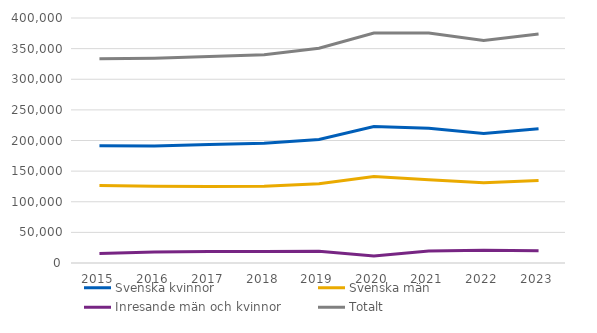
| Category | Svenska kvinnor | Svenska män | Inresande män och kvinnor | Totalt |
|---|---|---|---|---|
| 2015.0 | 191400 | 126500 | 15500 | 333300 |
| 2016.0 | 191100 | 125300 | 18000 | 334400 |
| 2017.0 | 193300 | 124700 | 18900 | 337000 |
| 2018.0 | 195600 | 125500 | 18900 | 340000 |
| 2019.0 | 201700 | 129500 | 19300 | 350500 |
| 2020.0 | 222800 | 141200 | 11500 | 375400 |
| 2021.0 | 219900 | 135900 | 19700 | 375600 |
| 2022.0 | 211400 | 130900 | 20800 | 363100 |
| 2023.0 | 219000 | 134800 | 19900 | 373700 |